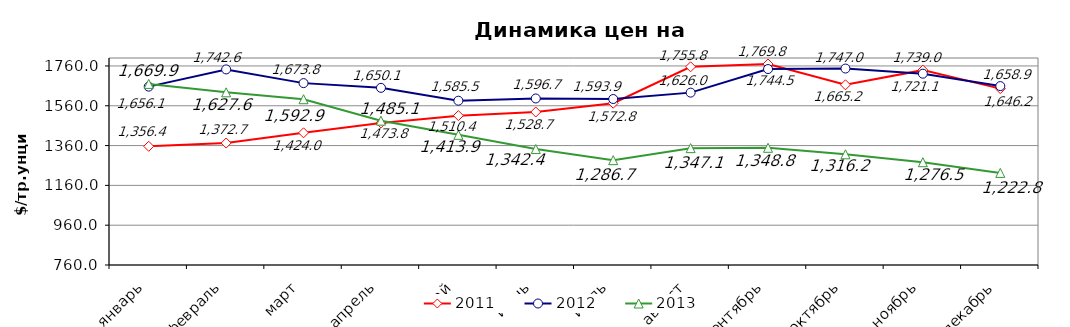
| Category | 2011 | 2012 | 2013 |
|---|---|---|---|
| январь | 1356.4 | 1656.12 | 1669.91 |
| февраль | 1372.73 | 1742.62 | 1627.59 |
| март | 1424.01 | 1673.77 | 1592.86 |
| апрель | 1473.81 | 1650.07 | 1485.08 |
| май | 1510.44 | 1585.5 | 1413.87 |
| июнь | 1528.66 | 1596.7 | 1342.36 |
| июль | 1572.81 | 1593.9 | 1286.72 |
| август | 1755.81 | 1626 | 1347.1 |
| сентябрь | 1769.76 | 1744.5 | 1348.8 |
| октябрь | 1665.214 | 1747.01 | 1316.18 |
| ноябрь | 1738.98 | 1721.13 | 1276.45 |
| декабрь | 1646.2 | 1658.87 | 1222.76 |